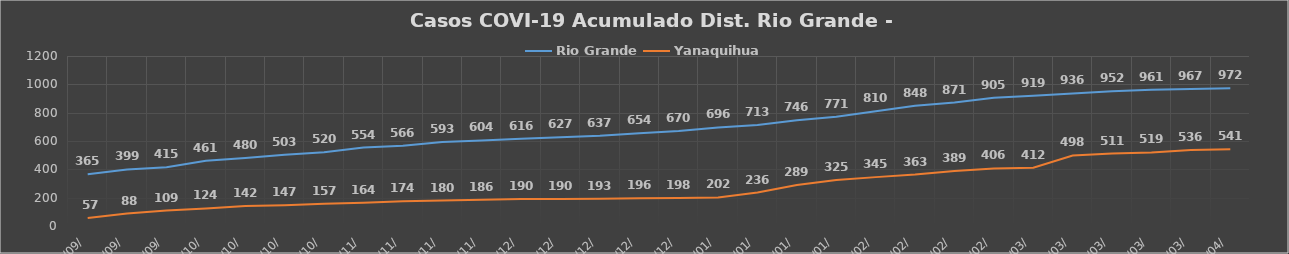
| Category | Rio Grande | Yanaquihua  |
|---|---|---|
| 7/09/ | 365 | 57 |
| 21/09/ | 399 | 88 |
| 29/09/ | 415 | 109 |
| 06/10/ | 461 | 124 |
| 13/10/ | 480 | 142 |
| 20/10/ | 503 | 147 |
| 27/10/ | 520 | 157 |
| 03/11/ | 554 | 164 |
| 10/11/ | 566 | 174 |
| 17/11/ | 593 | 180 |
| 24/11/ | 604 | 186 |
| 01/12/ | 616 | 190 |
| 08/12/ | 627 | 190 |
| 15/12/ | 637 | 193 |
| 22/12/ | 654 | 196 |
| 29/12/ | 670 | 198 |
| 05/01/ | 696 | 202 |
| 12/01/ | 713 | 236 |
| 19/01/ | 746 | 289 |
| 26/01/ | 771 | 325 |
| 02/02/ | 810 | 345 |
| 09/02/ | 848 | 363 |
| 16/02/ | 871 | 389 |
| 23/02/ | 905 | 406 |
| 02/03/ | 919 | 412 |
| 09/03/ | 936 | 498 |
| 16/03/ | 952 | 511 |
| 23/03/ | 961 | 519 |
| 30/03/ | 967 | 536 |
| 06/04/ | 972 | 541 |